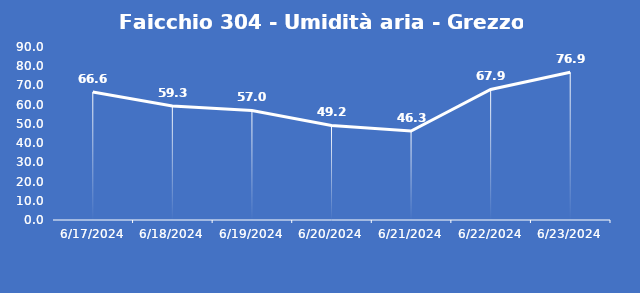
| Category | Faicchio 304 - Umidità aria - Grezzo (%) |
|---|---|
| 6/17/24 | 66.6 |
| 6/18/24 | 59.3 |
| 6/19/24 | 57 |
| 6/20/24 | 49.2 |
| 6/21/24 | 46.3 |
| 6/22/24 | 67.9 |
| 6/23/24 | 76.9 |